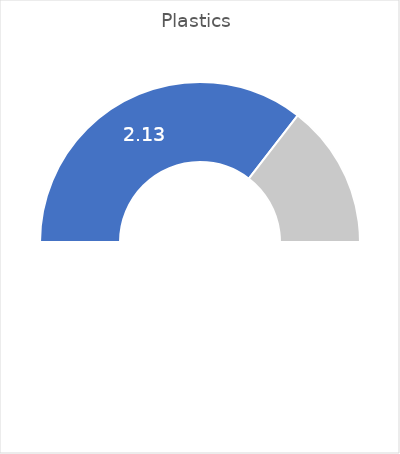
| Category | Series 0 |
|---|---|
| 0 | 0.709 |
| 1 | 0.291 |
| 2 | 1 |